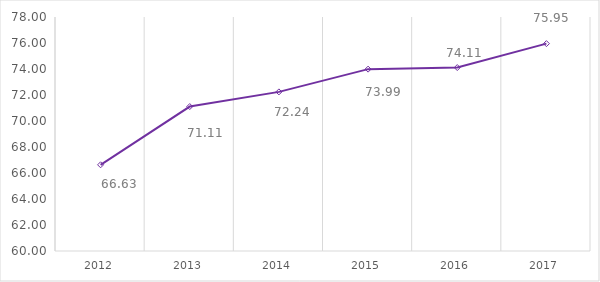
| Category | Series 0 |
|---|---|
| 2012.0 | 66.63 |
| 2013.0 | 71.11 |
| 2014.0 | 72.24 |
| 2015.0 | 73.99 |
| 2016.0 | 74.11 |
| 2017.0 | 75.95 |